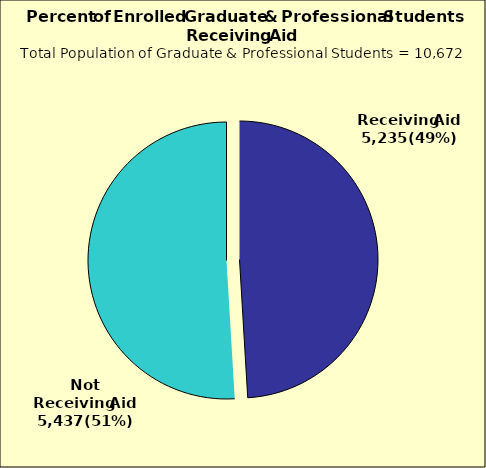
| Category | Series 0 |
|---|---|
| 0 | 5235 |
| 1 | 5437 |